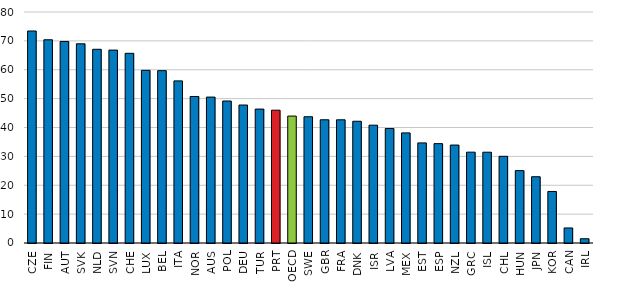
| Category | 2014 |
|---|---|
| CZE | 73.415 |
| FIN | 70.382 |
| AUT | 69.8 |
| SVK | 68.989 |
| NLD | 67.086 |
| SVN | 66.802 |
| CHE | 65.692 |
| LUX | 59.8 |
| BEL | 59.691 |
| ITA | 56.146 |
| NOR | 50.744 |
| AUS | 50.531 |
| POL | 49.176 |
| DEU | 47.783 |
| TUR | 46.38 |
| PRT | 45.993 |
| OECD | 43.959 |
| SWE | 43.724 |
| GBR | 42.675 |
| FRA | 42.666 |
| DNK | 42.163 |
| ISR | 40.803 |
| LVA | 39.643 |
| MEX | 38.134 |
| EST | 34.666 |
| ESP | 34.415 |
| NZL | 33.919 |
| GRC | 31.458 |
| ISL | 31.444 |
| CHL | 30.021 |
| HUN | 25.07 |
| JPN | 22.949 |
| KOR | 17.849 |
| CAN | 5.211 |
| IRL | 1.473 |